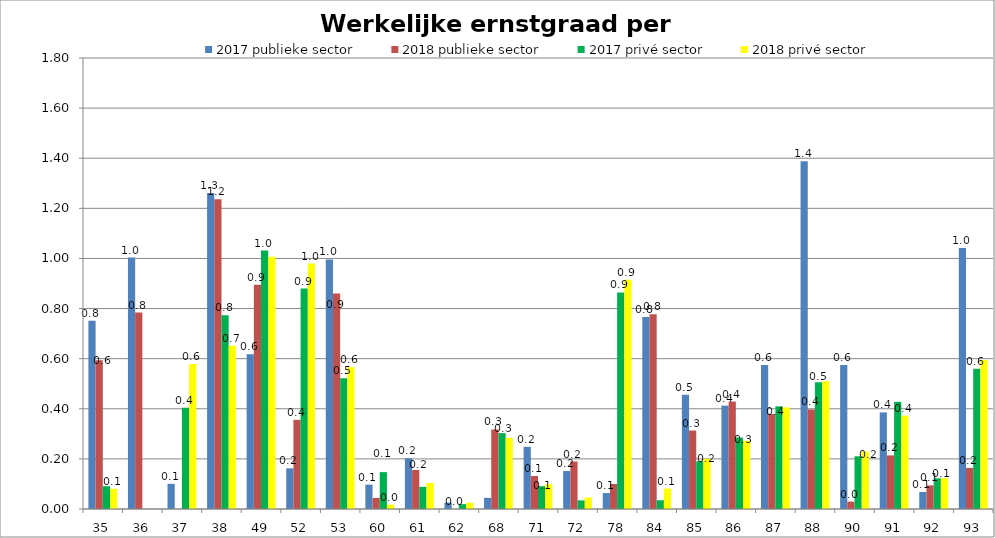
| Category | 2017 publieke sector | 2018 publieke sector | 2017 privé sector | 2018 privé sector |
|---|---|---|---|---|
| 35 | 0.751 | 0.594 | 0.091 | 0.081 |
| 36 | 1.003 | 0.784 | 0 | 0 |
| 37 | 0.1 | 0 | 0.405 | 0.579 |
| 38 | 1.261 | 1.236 | 0.773 | 0.652 |
| 49 | 0.618 | 0.895 | 1.031 | 1.007 |
| 52 | 0.162 | 0.356 | 0.88 | 0.979 |
| 53 | 0.996 | 0.86 | 0.522 | 0.566 |
| 60 | 0.097 | 0.044 | 0.147 | 0.017 |
| 61 | 0.203 | 0.156 | 0.088 | 0.104 |
| 62 | 0.025 | 0 | 0.019 | 0.025 |
| 68 | 0.045 | 0.317 | 0.303 | 0.284 |
| 71 | 0.248 | 0.132 | 0.091 | 0.099 |
| 72 | 0.151 | 0.189 | 0.034 | 0.046 |
| 78 | 0.064 | 0.1 | 0.865 | 0.915 |
| 84 | 0.767 | 0.777 | 0.035 | 0.082 |
| 85 | 0.456 | 0.313 | 0.191 | 0.2 |
| 86 | 0.412 | 0.429 | 0.285 | 0.272 |
| 87 | 0.574 | 0.379 | 0.41 | 0.406 |
| 88 | 1.388 | 0.397 | 0.506 | 0.51 |
| 90 | 0.575 | 0.029 | 0.21 | 0.229 |
| 91 | 0.386 | 0.214 | 0.428 | 0.372 |
| 92 | 0.068 | 0.094 | 0.123 | 0.123 |
| 93 | 1.042 | 0.164 | 0.56 | 0.595 |